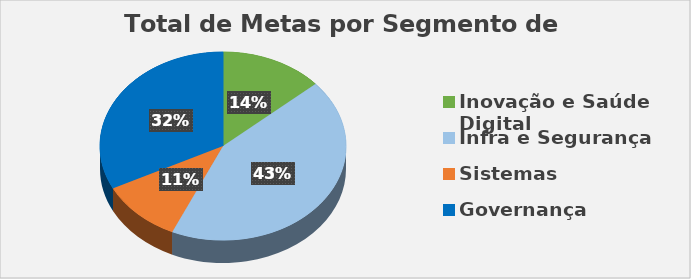
| Category | Series 0 |
|---|---|
| Inovação e Saúde Digital | 5 |
| Infra e Segurança | 16 |
| Sistemas | 4 |
| Governança | 12 |